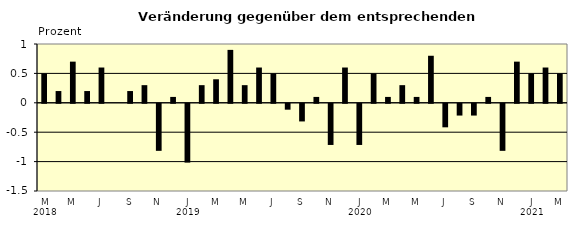
| Category | Series 0 |
|---|---|
| 0 | 0.5 |
| 1 | 0.2 |
| 2 | 0.7 |
| 3 | 0.2 |
| 4 | 0.6 |
| 5 | 0 |
| 6 | 0.2 |
| 7 | 0.3 |
| 8 | -0.8 |
| 9 | 0.1 |
| 10 | -1 |
| 11 | 0.3 |
| 12 | 0.4 |
| 13 | 0.9 |
| 14 | 0.3 |
| 15 | 0.6 |
| 16 | 0.5 |
| 17 | -0.1 |
| 18 | -0.3 |
| 19 | 0.1 |
| 20 | -0.7 |
| 21 | 0.6 |
| 22 | -0.7 |
| 23 | 0.5 |
| 24 | 0.1 |
| 25 | 0.3 |
| 26 | 0.1 |
| 27 | 0.8 |
| 28 | -0.4 |
| 29 | -0.2 |
| 30 | -0.2 |
| 31 | 0.1 |
| 32 | -0.8 |
| 33 | 0.7 |
| 34 | 0.5 |
| 35 | 0.6 |
| 36 | 0.5 |